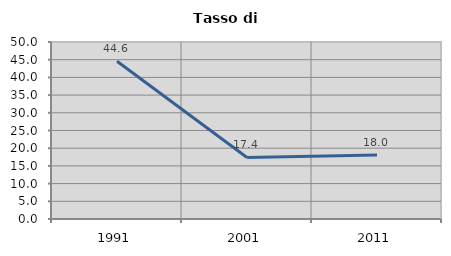
| Category | Tasso di disoccupazione   |
|---|---|
| 1991.0 | 44.559 |
| 2001.0 | 17.375 |
| 2011.0 | 18.046 |